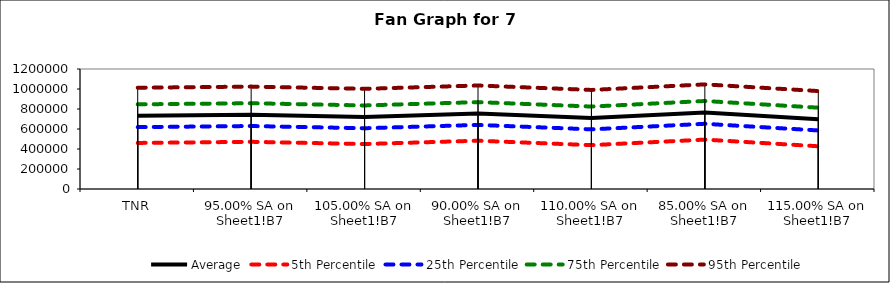
| Category | Average | 5th Percentile | 25th Percentile | 75th Percentile | 95th Percentile |
|---|---|---|---|---|---|
| TNR | 731715.206 | 460710.928 | 618722.267 | 846658.144 | 1012802.523 |
| 95.00% SA on Sheet1!B7 | 742824.206 | 471819.928 | 629831.267 | 857767.144 | 1023911.523 |
| 105.00% SA on Sheet1!B7 | 720606.206 | 449601.928 | 607613.267 | 835549.144 | 1001693.523 |
| 90.00% SA on Sheet1!B7 | 753933.206 | 482928.928 | 640940.267 | 868876.144 | 1035020.523 |
| 110.00% SA on Sheet1!B7 | 709497.206 | 438492.928 | 596504.267 | 824440.144 | 990584.523 |
| 85.00% SA on Sheet1!B7 | 765042.206 | 494037.928 | 652049.267 | 879985.144 | 1046129.523 |
| 115.00% SA on Sheet1!B7 | 698388.206 | 427383.928 | 585395.267 | 813331.144 | 979475.523 |